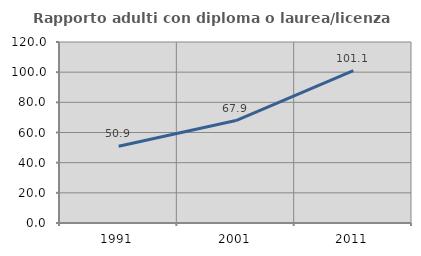
| Category | Rapporto adulti con diploma o laurea/licenza media  |
|---|---|
| 1991.0 | 50.893 |
| 2001.0 | 67.919 |
| 2011.0 | 101.061 |